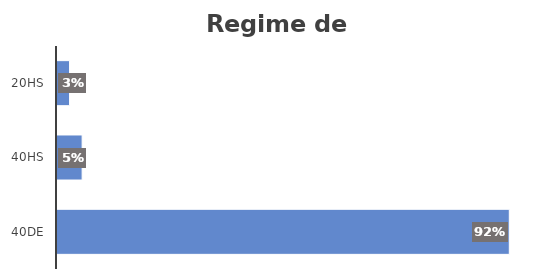
| Category | Series 0 |
|---|---|
| 40DE | 0.923 |
| 40HS | 0.051 |
| 20HS | 0.026 |